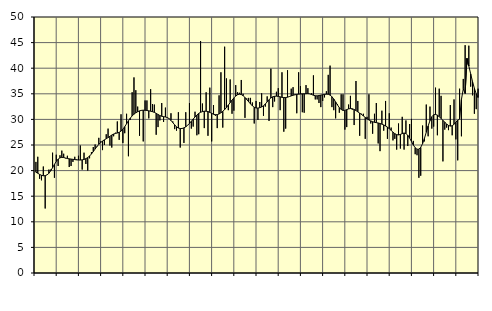
| Category | Piggar | Series 1 |
|---|---|---|
| nan | 21.7 | 19.68 |
| 1.0 | 22.7 | 19.49 |
| 1.0 | 18.4 | 19.25 |
| 1.0 | 18.1 | 19.08 |
| 1.0 | 20.8 | 18.99 |
| 1.0 | 12.6 | 19.01 |
| 1.0 | 19.2 | 19.16 |
| 1.0 | 20.2 | 19.47 |
| 1.0 | 20.2 | 19.96 |
| 1.0 | 23.5 | 20.57 |
| 1.0 | 18.6 | 21.21 |
| 1.0 | 23.1 | 21.79 |
| nan | 20.9 | 22.24 |
| 2.0 | 23 | 22.5 |
| 2.0 | 23.9 | 22.58 |
| 2.0 | 23.3 | 22.55 |
| 2.0 | 22.4 | 22.46 |
| 2.0 | 22.9 | 22.36 |
| 2.0 | 20.7 | 22.3 |
| 2.0 | 20.9 | 22.25 |
| 2.0 | 21.7 | 22.2 |
| 2.0 | 22.7 | 22.15 |
| 2.0 | 22.2 | 22.1 |
| 2.0 | 22.9 | 22.08 |
| nan | 24.9 | 22.06 |
| 3.0 | 20.2 | 22.1 |
| 3.0 | 23.5 | 22.18 |
| 3.0 | 21.3 | 22.33 |
| 3.0 | 20 | 22.55 |
| 3.0 | 22.4 | 22.85 |
| 3.0 | 23.6 | 23.24 |
| 3.0 | 24.6 | 23.71 |
| 3.0 | 25.1 | 24.21 |
| 3.0 | 24.8 | 24.7 |
| 3.0 | 26.4 | 25.14 |
| 3.0 | 25.7 | 25.49 |
| nan | 24 | 25.77 |
| 4.0 | 25 | 26.01 |
| 4.0 | 27.1 | 26.22 |
| 4.0 | 28.2 | 26.45 |
| 4.0 | 24.9 | 26.7 |
| 4.0 | 24.5 | 26.95 |
| 4.0 | 26.7 | 27.14 |
| 4.0 | 27.4 | 27.26 |
| 4.0 | 29.6 | 27.34 |
| 4.0 | 26 | 27.48 |
| 4.0 | 31 | 27.71 |
| 4.0 | 25.4 | 28.09 |
| nan | 27.3 | 28.58 |
| 5.0 | 31.1 | 29.14 |
| 5.0 | 22.8 | 29.72 |
| 5.0 | 29.9 | 30.24 |
| 5.0 | 35.3 | 30.68 |
| 5.0 | 38.2 | 31.02 |
| 5.0 | 35.7 | 31.29 |
| 5.0 | 32.5 | 31.5 |
| 5.0 | 26.8 | 31.66 |
| 5.0 | 31.7 | 31.76 |
| 5.0 | 25.7 | 31.8 |
| 5.0 | 33.7 | 31.78 |
| nan | 33.7 | 31.74 |
| 6.0 | 30.2 | 31.68 |
| 6.0 | 35.9 | 31.6 |
| 6.0 | 33 | 31.51 |
| 6.0 | 32.9 | 31.37 |
| 6.0 | 27 | 31.18 |
| 6.0 | 28.5 | 30.96 |
| 6.0 | 29.8 | 30.75 |
| 6.0 | 33.2 | 30.61 |
| 6.0 | 29.5 | 30.53 |
| 6.0 | 32.3 | 30.47 |
| 6.0 | 30.4 | 30.37 |
| nan | 30.1 | 30.15 |
| 7.0 | 31.2 | 29.8 |
| 7.0 | 29.6 | 29.38 |
| 7.0 | 28.1 | 28.93 |
| 7.0 | 27.8 | 28.54 |
| 7.0 | 31.4 | 28.31 |
| 7.0 | 24.5 | 28.22 |
| 7.0 | 28.3 | 28.23 |
| 7.0 | 25.4 | 28.35 |
| 7.0 | 31.4 | 28.55 |
| 7.0 | 28.9 | 28.86 |
| 7.0 | 33.2 | 29.22 |
| nan | 28.2 | 29.63 |
| 8.0 | 28.6 | 30.06 |
| 8.0 | 31.5 | 30.48 |
| 8.0 | 26.9 | 30.86 |
| 8.0 | 27.1 | 31.17 |
| 8.0 | 45.3 | 31.39 |
| 8.0 | 33.1 | 31.52 |
| 8.0 | 28.3 | 31.6 |
| 8.0 | 35.3 | 31.6 |
| 8.0 | 26.8 | 31.53 |
| 8.0 | 36.2 | 31.37 |
| 8.0 | 25.7 | 31.18 |
| nan | 32.8 | 31.01 |
| 9.0 | 30.7 | 30.92 |
| 9.0 | 28.3 | 30.93 |
| 9.0 | 34.7 | 31.06 |
| 9.0 | 39.2 | 31.29 |
| 9.0 | 28.4 | 31.58 |
| 9.0 | 44.2 | 31.91 |
| 9.0 | 38 | 32.33 |
| 9.0 | 31.8 | 32.8 |
| 9.0 | 37.8 | 33.28 |
| 9.0 | 31.1 | 33.76 |
| 9.0 | 31.7 | 34.19 |
| nan | 36.7 | 34.56 |
| 10.0 | 35.3 | 34.82 |
| 10.0 | 35.2 | 34.93 |
| 10.0 | 37.7 | 34.86 |
| 10.0 | 35 | 34.63 |
| 10.0 | 30.3 | 34.28 |
| 10.0 | 34.1 | 33.87 |
| 10.0 | 34.2 | 33.44 |
| 10.0 | 34.2 | 33.02 |
| 10.0 | 33.3 | 32.65 |
| 10.0 | 29.2 | 32.37 |
| 10.0 | 33.6 | 32.23 |
| nan | 29.9 | 32.21 |
| 11.0 | 33.4 | 32.29 |
| 11.0 | 35.1 | 32.43 |
| 11.0 | 30.7 | 32.66 |
| 11.0 | 32.5 | 33.01 |
| 11.0 | 34.5 | 33.43 |
| 11.0 | 29.7 | 33.85 |
| 11.0 | 39.9 | 34.19 |
| 11.0 | 32.4 | 34.41 |
| 11.0 | 33.5 | 34.51 |
| 11.0 | 35.4 | 34.54 |
| 11.0 | 36.1 | 34.5 |
| nan | 31.8 | 34.41 |
| 12.0 | 39.2 | 34.31 |
| 12.0 | 27.6 | 34.26 |
| 12.0 | 28.2 | 34.27 |
| 12.0 | 39.6 | 34.34 |
| 12.0 | 34.5 | 34.46 |
| 12.0 | 36 | 34.59 |
| 12.0 | 36.3 | 34.72 |
| 12.0 | 34.9 | 34.8 |
| 12.0 | 31.2 | 34.88 |
| 12.0 | 39.2 | 34.93 |
| 12.0 | 36.5 | 34.97 |
| nan | 31.4 | 34.99 |
| 13.0 | 31.3 | 35 |
| 13.0 | 36.7 | 35.02 |
| 13.0 | 36.1 | 35.04 |
| 13.0 | 35 | 34.99 |
| 13.0 | 35.1 | 34.86 |
| 13.0 | 38.6 | 34.72 |
| 13.0 | 33.9 | 34.62 |
| 13.0 | 33.9 | 34.6 |
| 13.0 | 33.2 | 34.66 |
| 13.0 | 32.4 | 34.75 |
| 13.0 | 33.6 | 34.81 |
| nan | 34.3 | 34.87 |
| 14.0 | 35.5 | 34.93 |
| 14.0 | 38.7 | 34.91 |
| 14.0 | 40.5 | 34.75 |
| 14.0 | 32.4 | 34.43 |
| 14.0 | 31.8 | 33.98 |
| 14.0 | 30.2 | 33.42 |
| 14.0 | 33 | 32.82 |
| 14.0 | 31.3 | 32.3 |
| 14.0 | 34.9 | 31.93 |
| 14.0 | 34.9 | 31.76 |
| 14.0 | 28 | 31.77 |
| nan | 28.5 | 31.91 |
| 15.0 | 32.9 | 32.05 |
| 15.0 | 34.6 | 32.12 |
| 15.0 | 31.9 | 32.08 |
| 15.0 | 28.9 | 31.94 |
| 15.0 | 37.5 | 31.72 |
| 15.0 | 33.6 | 31.47 |
| 15.0 | 26.8 | 31.22 |
| 15.0 | 31.1 | 30.96 |
| 15.0 | 31.1 | 30.68 |
| 15.0 | 26.2 | 30.38 |
| 15.0 | 30.5 | 30.1 |
| nan | 34.9 | 29.88 |
| 16.0 | 29.2 | 29.7 |
| 16.0 | 27.2 | 29.55 |
| 16.0 | 31.1 | 29.43 |
| 16.0 | 33.2 | 29.37 |
| 16.0 | 25.3 | 29.3 |
| 16.0 | 23.8 | 29.2 |
| 16.0 | 31.7 | 29.07 |
| 16.0 | 27.8 | 28.92 |
| 16.0 | 33.6 | 28.71 |
| 16.0 | 26.2 | 28.48 |
| 16.0 | 31.2 | 28.2 |
| nan | 28.4 | 27.86 |
| 17.0 | 25.9 | 27.51 |
| 17.0 | 26.2 | 27.21 |
| 17.0 | 24.1 | 27.02 |
| 17.0 | 29.2 | 26.97 |
| 17.0 | 24.3 | 27.07 |
| 17.0 | 30.5 | 27.23 |
| 17.0 | 24.1 | 27.34 |
| 17.0 | 29.8 | 27.24 |
| 17.0 | 24.8 | 26.91 |
| 17.0 | 29.1 | 26.35 |
| 17.0 | 30.1 | 25.68 |
| nan | 25.8 | 25.01 |
| 18.0 | 23.2 | 24.46 |
| 18.0 | 23 | 24.17 |
| 18.0 | 18.6 | 24.19 |
| 18.0 | 19 | 24.54 |
| 18.0 | 28.8 | 25.26 |
| 18.0 | 25.7 | 26.29 |
| 18.0 | 32.9 | 27.49 |
| 18.0 | 26.7 | 28.71 |
| 18.0 | 32.5 | 29.75 |
| 18.0 | 28.2 | 30.51 |
| 18.0 | 28.6 | 30.9 |
| nan | 36.2 | 30.97 |
| 19.0 | 26.9 | 30.83 |
| 19.0 | 36 | 30.53 |
| 19.0 | 34.6 | 30.17 |
| 19.0 | 21.8 | 29.82 |
| 19.0 | 28 | 29.45 |
| 19.0 | 28.4 | 29.1 |
| 19.0 | 27.9 | 28.82 |
| 19.0 | 32.8 | 28.69 |
| 19.0 | 26.9 | 28.76 |
| 19.0 | 33.9 | 29.04 |
| 19.0 | 26.1 | 29.45 |
| nan | 22 | 29.85 |
| 20.0 | 36 | 30.06 |
| 20.0 | 26.7 | 33.89 |
| 20.0 | 37.9 | 35.97 |
| 20.0 | 44.5 | 35.07 |
| 20.0 | 40.7 | 41.91 |
| 20.0 | 44.4 | 40.43 |
| 20.0 | 36.4 | 38.89 |
| 20.0 | 34.7 | 37.4 |
| 20.0 | 31.1 | 36.07 |
| 20.0 | 32 | 35 |
| 20.0 | 36 | 34.26 |